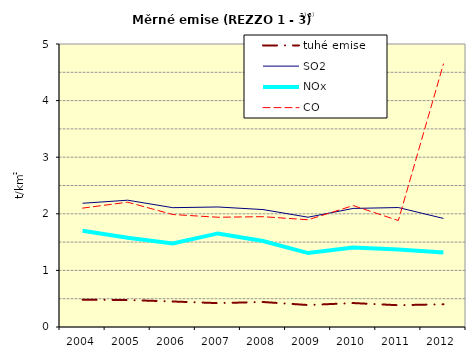
| Category | tuhé emise | SO2 | NOx | CO |
|---|---|---|---|---|
| 2004.0 | 0.484 | 2.186 | 1.702 | 2.1 |
| 2005.0 | 0.477 | 2.24 | 1.577 | 2.205 |
| 2006.0 | 0.451 | 2.108 | 1.477 | 1.987 |
| 2007.0 | 0.422 | 2.12 | 1.653 | 1.939 |
| 2008.0 | 0.442 | 2.075 | 1.519 | 1.949 |
| 2009.0 | 0.388 | 1.94 | 1.306 | 1.895 |
| 2010.0 | 0.423 | 2.095 | 1.403 | 2.145 |
| 2011.0 | 0.385 | 2.111 | 1.368 | 1.881 |
| 2012.0 | 0.402 | 1.918 | 1.317 | 4.647 |